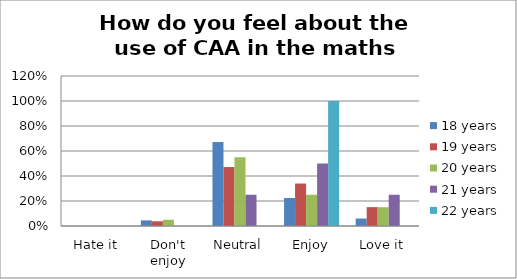
| Category | 18 years | 19 years | 20 years | 21 years | 22 years |
|---|---|---|---|---|---|
| Hate it | 0 | 0 | 0 | 0 | 0 |
| Don't enjoy | 0.045 | 0.038 | 0.05 | 0 | 0 |
| Neutral | 0.672 | 0.472 | 0.55 | 0.25 | 0 |
| Enjoy | 0.224 | 0.34 | 0.25 | 0.5 | 1 |
| Love it | 0.06 | 0.151 | 0.15 | 0.25 | 0 |